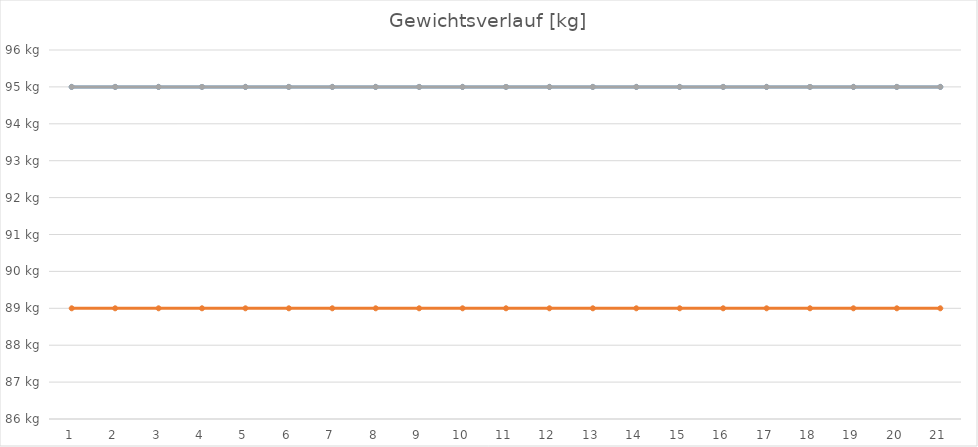
| Category | Series 0 | Series 1 | Series 2 |
|---|---|---|---|
| 0 | 95 | 89 | 95 |
| 1 | 95 | 89 | 95 |
| 2 | 95 | 89 | 95 |
| 3 | 95 | 89 | 95 |
| 4 | 95 | 89 | 95 |
| 5 | 95 | 89 | 95 |
| 6 | 95 | 89 | 95 |
| 7 | 95 | 89 | 95 |
| 8 | 95 | 89 | 95 |
| 9 | 95 | 89 | 95 |
| 10 | 95 | 89 | 95 |
| 11 | 95 | 89 | 95 |
| 12 | 95 | 89 | 95 |
| 13 | 95 | 89 | 95 |
| 14 | 95 | 89 | 95 |
| 15 | 95 | 89 | 95 |
| 16 | 95 | 89 | 95 |
| 17 | 95 | 89 | 95 |
| 18 | 95 | 89 | 95 |
| 19 | 95 | 89 | 95 |
| 20 | 95 | 89 | 95 |